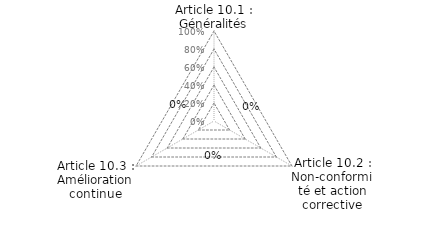
| Category | Article 10.1 : Généralités Article 10.2 : Non-conformité et action corrective Article 10.3 : Amélioration continue |
|---|---|
| Article 10.1 : Généralités | 0 |
| Article 10.2 : Non-conformité et action corrective | 0 |
| Article 10.3 : Amélioration continue | 0 |